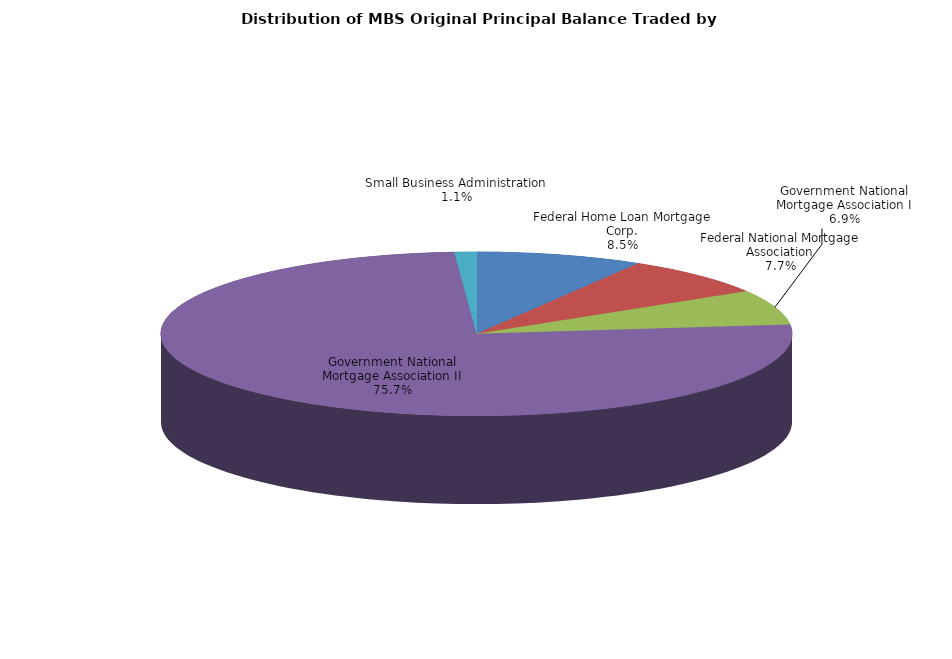
| Category | Series 0 |
|---|---|
| Federal Home Loan Mortgage Corp. | 660059248.826 |
| Federal National Mortgage Association | 599299711.712 |
| Government National Mortgage Association I | 534647448.852 |
| Government National Mortgage Association II | 5852679988.774 |
| Small Business Administration | 86973474.752 |